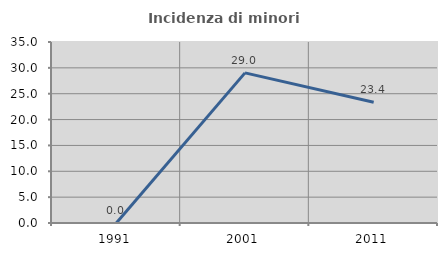
| Category | Incidenza di minori stranieri |
|---|---|
| 1991.0 | 0 |
| 2001.0 | 29.032 |
| 2011.0 | 23.358 |